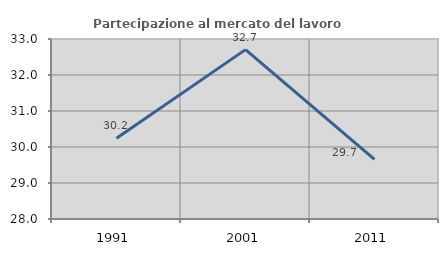
| Category | Partecipazione al mercato del lavoro  femminile |
|---|---|
| 1991.0 | 30.246 |
| 2001.0 | 32.705 |
| 2011.0 | 29.657 |